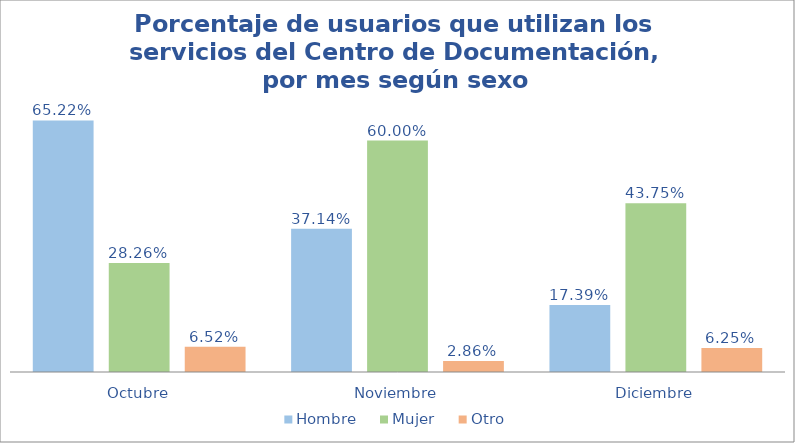
| Category | Hombre | Mujer | Otro |
|---|---|---|---|
| Octubre | 0.652 | 0.283 | 0.065 |
| Noviembre | 0.371 | 0.6 | 0.029 |
| Diciembre | 0.174 | 0.438 | 0.062 |